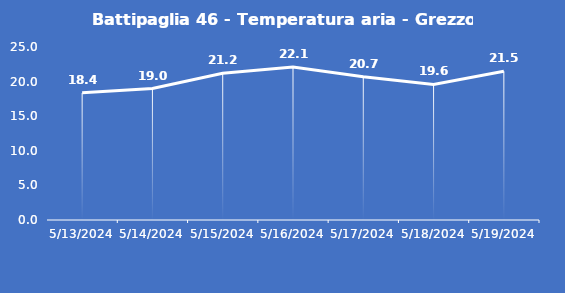
| Category | Battipaglia 46 - Temperatura aria - Grezzo (°C) |
|---|---|
| 5/13/24 | 18.4 |
| 5/14/24 | 19 |
| 5/15/24 | 21.2 |
| 5/16/24 | 22.1 |
| 5/17/24 | 20.7 |
| 5/18/24 | 19.6 |
| 5/19/24 | 21.5 |